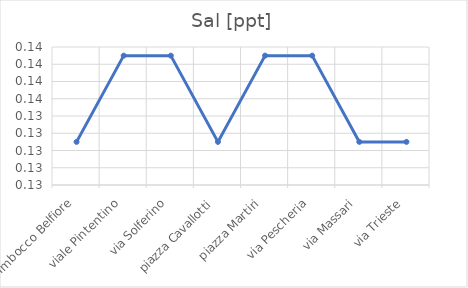
| Category | Sal [ppt] |
|---|---|
| Imbocco Belfiore | 0.13 |
| viale Pintentino | 0.14 |
| via Solferino | 0.14 |
| piazza Cavallotti | 0.13 |
| piazza Martiri | 0.14 |
| via Pescheria | 0.14 |
| via Massari | 0.13 |
| via Trieste | 0.13 |